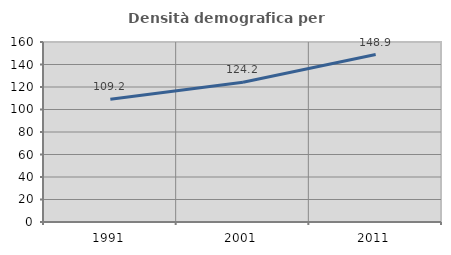
| Category | Densità demografica |
|---|---|
| 1991.0 | 109.153 |
| 2001.0 | 124.183 |
| 2011.0 | 148.85 |